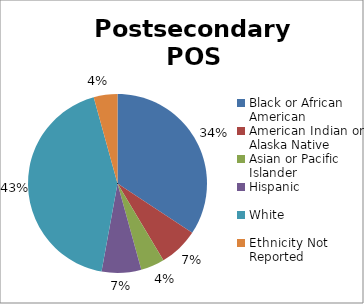
| Category | Series 0 |
|---|---|
| Black or African American | 0.343 |
| American Indian or Alaska Native | 0.071 |
| Asian or Pacific Islander | 0.043 |
| Hispanic | 0.071 |
| White | 0.429 |
| Ethnicity Not Reported | 0.043 |